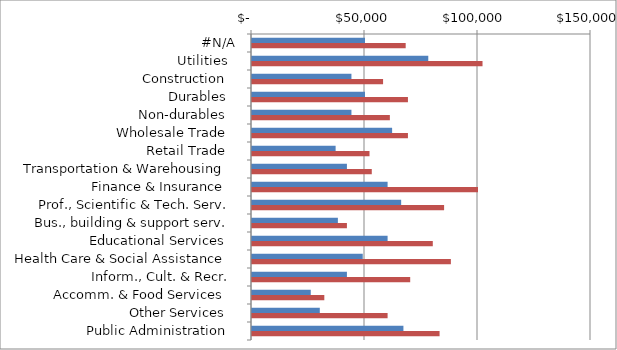
| Category | Series 0 | Series 1 |
|---|---|---|
|  #N/A  | 50000 | 68000 |
|  Utilities   | 78000 | 102000 |
|  Construction   | 44000 | 58000 |
|  Durables   | 50000 | 69000 |
|  Non-durables   | 44000 | 61000 |
|  Wholesale Trade   | 62000 | 69000 |
|  Retail Trade   | 37000 | 52000 |
|  Transportation & Warehousing   | 42000 | 53000 |
|  Finance & Insurance   | 60000 | 100000 |
|  Prof., Scientific & Tech. Serv.  | 66000 | 85000 |
|  Bus., building & support serv.  | 38000 | 42000 |
|  Educational Services   | 60000 | 80000 |
|  Health Care & Social Assistance   | 49000 | 88000 |
|  Inform., Cult. & Recr.  | 42000 | 70000 |
|  Accomm. & Food Services   | 26000 | 32000 |
|  Other Services   | 30000 | 60000 |
|  Public Administration   | 67000 | 83000 |